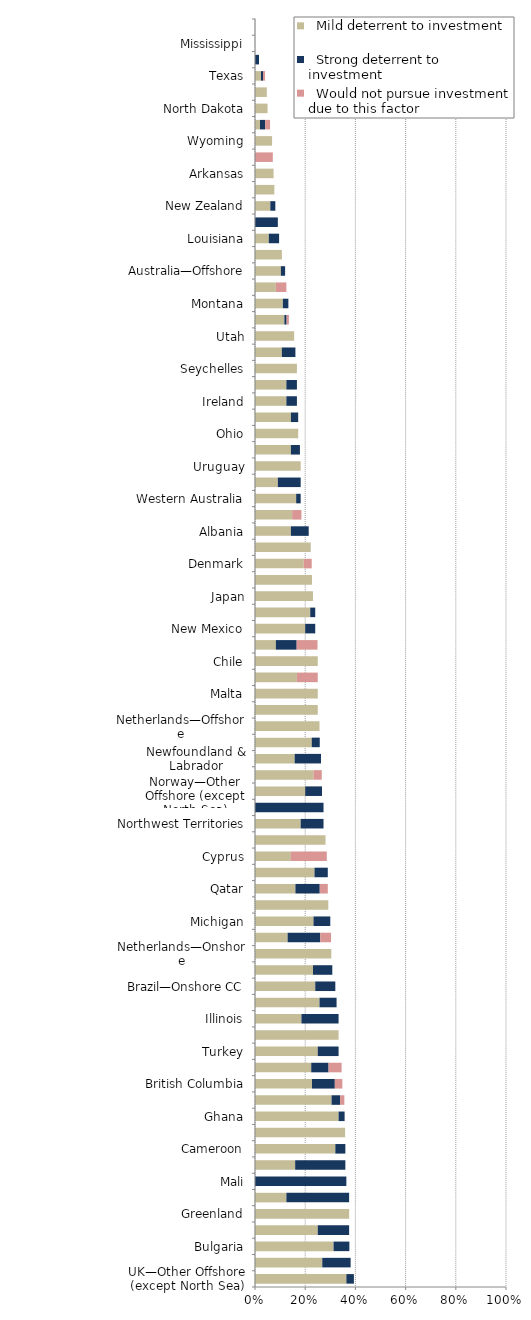
| Category |   Mild deterrent to investment |   Strong deterrent to investment |   Would not pursue investment due to this factor |
|---|---|---|---|
| UK—Other Offshore (except North Sea) | 0.364 | 0.03 | 0 |
| Vietnam | 0.268 | 0.113 | 0 |
| Bulgaria | 0.313 | 0.063 | 0 |
| Yukon | 0.25 | 0.125 | 0 |
| Greenland | 0.375 | 0 | 0 |
| Poland | 0.125 | 0.25 | 0 |
| Mali | 0 | 0.364 | 0 |
| Alaska | 0.16 | 0.2 | 0 |
| Cameroon | 0.32 | 0.04 | 0 |
| Papua New Guinea | 0.359 | 0 | 0 |
| Ghana | 0.333 | 0.024 | 0 |
| United Kingdom—North Sea | 0.305 | 0.034 | 0.017 |
| British Columbia | 0.227 | 0.091 | 0.03 |
| US Offshore—Gulf of Mexico | 0.224 | 0.069 | 0.052 |
| Turkey | 0.25 | 0.083 | 0 |
| Guyana | 0.333 | 0 | 0 |
| Illinois | 0.185 | 0.148 | 0 |
| Thailand | 0.257 | 0.068 | 0 |
| Brazil—Onshore CC | 0.24 | 0.08 | 0 |
| Suriname | 0.231 | 0.077 | 0 |
| Netherlands—Onshore | 0.304 | 0 | 0 |
| Madagascar | 0.13 | 0.13 | 0.043 |
| Michigan | 0.233 | 0.067 | 0 |
| Romania | 0.292 | 0 | 0 |
| Qatar | 0.161 | 0.097 | 0.032 |
| Queensland | 0.237 | 0.053 | 0 |
| Cyprus | 0.143 | 0 | 0.143 |
| Kenya | 0.281 | 0 | 0 |
| Northwest Territories | 0.182 | 0.091 | 0 |
| Niger | 0 | 0.273 | 0 |
| Norway—Other Offshore (except North Sea) | 0.2 | 0.067 | 0 |
| Trinidad and Tobago | 0.233 | 0 | 0.033 |
| Newfoundland & Labrador | 0.158 | 0.105 | 0 |
| Ivory Coast | 0.226 | 0.032 | 0 |
| Netherlands—Offshore | 0.257 | 0 | 0 |
| Georgia | 0.25 | 0 | 0 |
| Malta | 0.25 | 0 | 0 |
| Jordan | 0.167 | 0 | 0.083 |
| Chile | 0.25 | 0 | 0 |
| Tasmania | 0.083 | 0.083 | 0.083 |
| New Mexico | 0.2 | 0.04 | 0 |
| Norway—North Sea | 0.22 | 0.02 | 0 |
| Japan | 0.231 | 0 | 0 |
| West Virginia | 0.227 | 0 | 0 |
| Denmark | 0.194 | 0 | 0.032 |
| Peru | 0.222 | 0 | 0 |
| Albania | 0.143 | 0.071 | 0 |
| Morocco | 0.148 | 0 | 0.037 |
| Western Australia | 0.164 | 0.018 | 0 |
| Faroe Islands | 0.091 | 0.091 | 0 |
| Uruguay | 0.182 | 0 | 0 |
| Namibia | 0.143 | 0.036 | 0 |
| Ohio | 0.172 | 0 | 0 |
| Philippines | 0.143 | 0.029 | 0 |
| Ireland | 0.125 | 0.042 | 0 |
| Pakistan | 0.125 | 0.042 | 0 |
| Seychelles | 0.167 | 0 | 0 |
| Colombia | 0.107 | 0.054 | 0 |
| Utah | 0.156 | 0 | 0 |
| Alberta | 0.117 | 0.009 | 0.009 |
| Montana | 0.111 | 0.022 | 0 |
| Alabama | 0.083 | 0 | 0.042 |
| Australia—Offshore | 0.103 | 0.017 | 0 |
| South Australia | 0.107 | 0 | 0 |
| Louisiana | 0.055 | 0.041 | 0 |
| Somaliland | 0 | 0.091 | 0 |
| New Zealand | 0.061 | 0.02 | 0 |
| Northern Territory | 0.077 | 0 | 0 |
| Arkansas | 0.074 | 0 | 0 |
| Manitoba | 0 | 0 | 0.071 |
| Wyoming | 0.068 | 0 | 0 |
| Saskatchewan | 0.02 | 0.02 | 0.02 |
| North Dakota | 0.05 | 0 | 0 |
| Kansas | 0.047 | 0 | 0 |
| Texas | 0.024 | 0.008 | 0.008 |
| Oklahoma | 0 | 0.016 | 0 |
| Mississippi | 0 | 0 | 0 |
| Ethiopia | 0 | 0 | 0 |